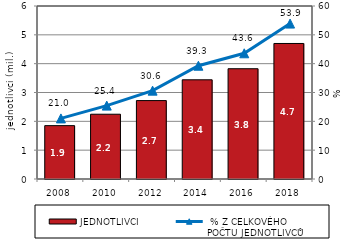
| Category | JEDNOTLIVCI  |
|---|---|
| 2008.0 | 1.851 |
| 2010.0 | 2.247 |
| 2012.0 | 2.72 |
| 2014.0 | 3.441 |
| 2016.0 | 3.824 |
| 2018.0 | 4.7 |